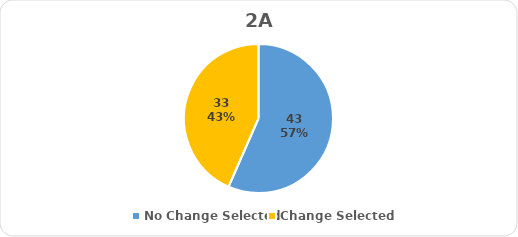
| Category | Series 0 |
|---|---|
| No Change Selected | 43 |
| Change Selected | 33 |